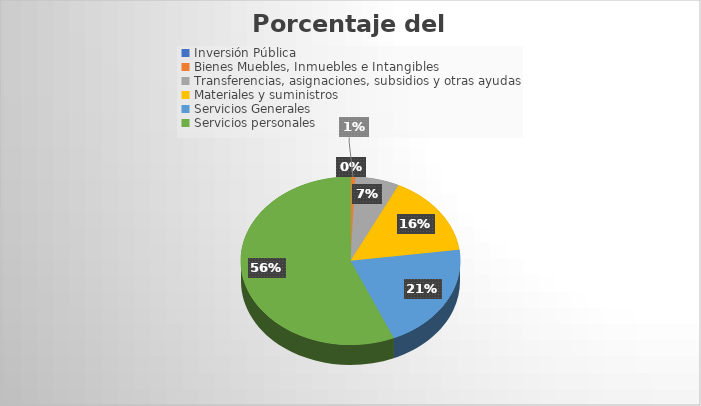
| Category | Porcentaje  |
|---|---|
| Inversión Pública | 0.05 |
| Bienes Muebles, Inmuebles e Intangibles | 0.639 |
| Transferencias, asignaciones, subsidios y otras ayudas | 6.503 |
| Materiales y suministros  | 15.701 |
| Servicios Generales | 20.656 |
| Servicios personales | 56.452 |